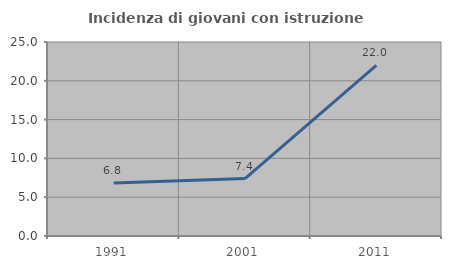
| Category | Incidenza di giovani con istruzione universitaria |
|---|---|
| 1991.0 | 6.818 |
| 2001.0 | 7.407 |
| 2011.0 | 22 |